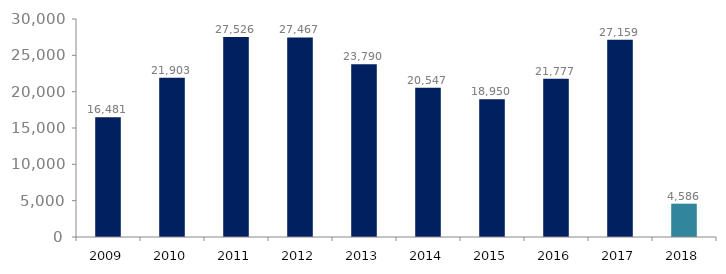
| Category | Series 1 |
|---|---|
| 2009.0 | 16481 |
| 2010.0 | 21903 |
| 2011.0 | 27526 |
| 2012.0 | 27467 |
| 2013.0 | 23790 |
| 2014.0 | 20547 |
| 2015.0 | 18950.14 |
| 2016.0 | 21776.636 |
| 2017.0 | 27158.582 |
| 2018.0 | 4586.188 |